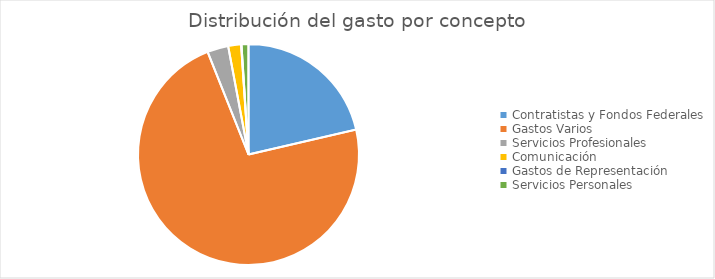
| Category | Series 0 |
|---|---|
| Contratistas y Fondos Federales | 98235116.54 |
| Gastos Varios | 333475196.76 |
| Servicios Profesionales | 14138378.5 |
| Comunicación | 8662577.51 |
| Gastos de Representación | 249651.79 |
| Servicios Personales | 4673555.35 |